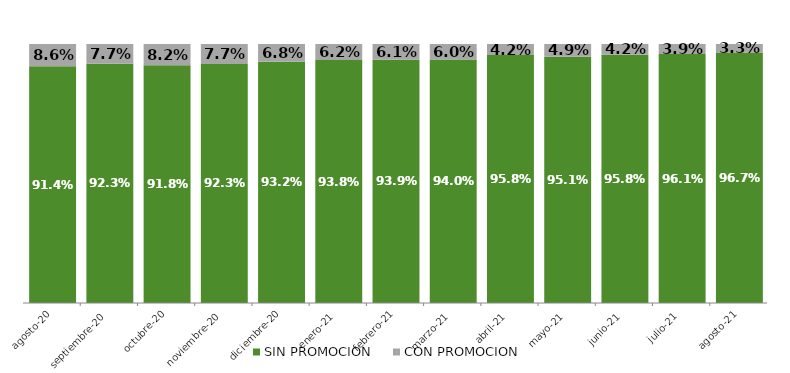
| Category | SIN PROMOCION   | CON PROMOCION   |
|---|---|---|
| 2020-08-01 | 0.914 | 0.086 |
| 2020-09-01 | 0.923 | 0.077 |
| 2020-10-01 | 0.918 | 0.082 |
| 2020-11-01 | 0.923 | 0.077 |
| 2020-12-01 | 0.932 | 0.068 |
| 2021-01-01 | 0.938 | 0.062 |
| 2021-02-01 | 0.939 | 0.061 |
| 2021-03-01 | 0.94 | 0.06 |
| 2021-04-01 | 0.958 | 0.042 |
| 2021-05-01 | 0.951 | 0.049 |
| 2021-06-01 | 0.958 | 0.042 |
| 2021-07-01 | 0.961 | 0.039 |
| 2021-08-01 | 0.967 | 0.033 |